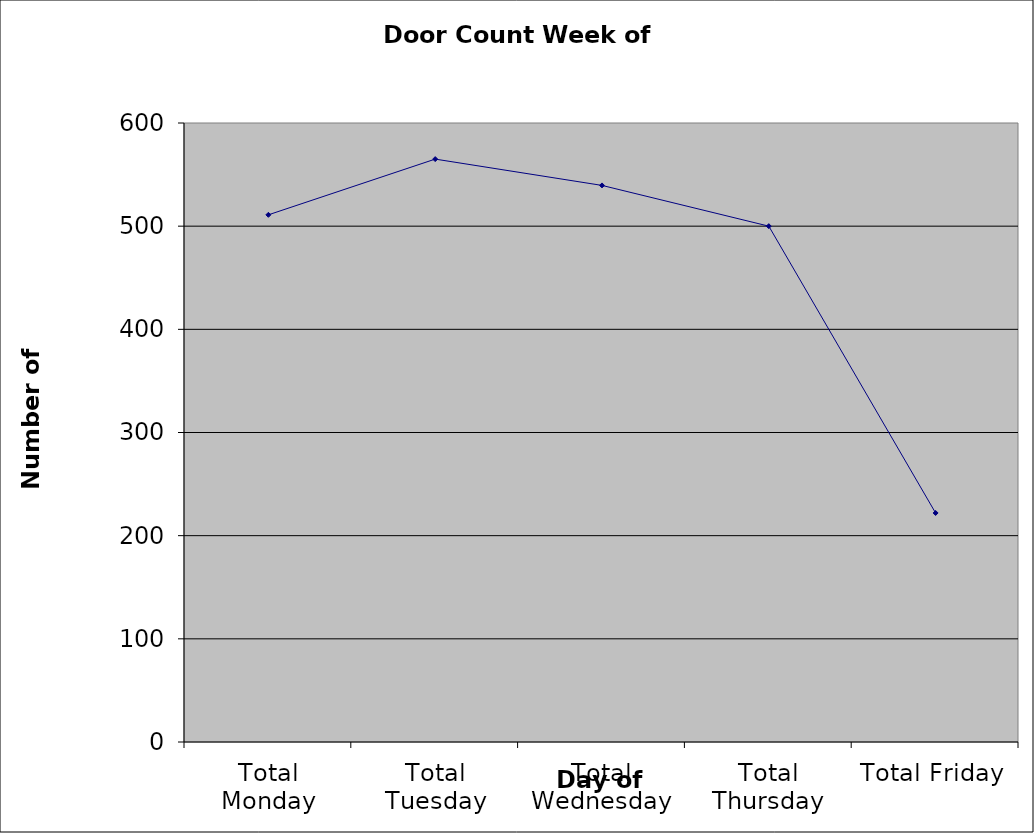
| Category | Series 0 |
|---|---|
| Total Monday | 511 |
| Total Tuesday | 565 |
| Total Wednesday | 539.5 |
| Total Thursday | 500 |
| Total Friday | 222 |